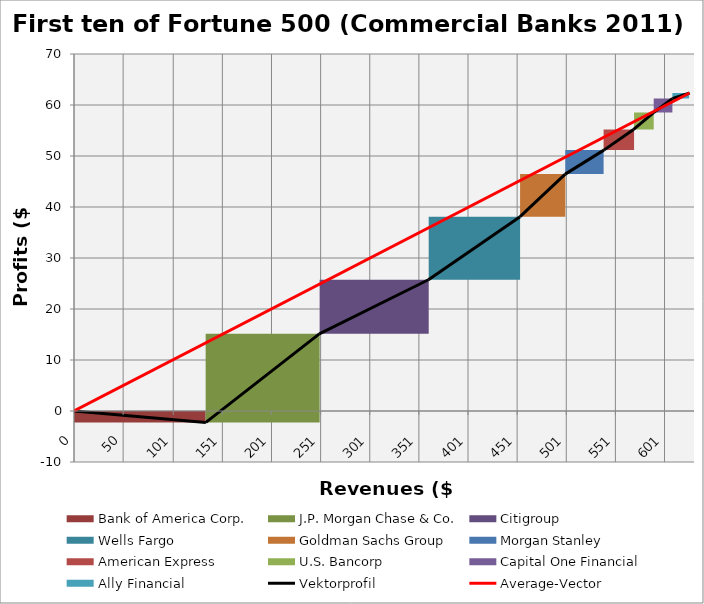
| Category | transparent | Bank of America Corp. | J.P. Morgan Chase & Co. | Citigroup | Wells Fargo | Goldman Sachs Group | Morgan Stanley | American Express | U.S. Bancorp | Capital One Financial | Ally Financial | Border right & top |
|---|---|---|---|---|---|---|---|---|---|---|---|---|
| 0.0 | 0 | -2.238 | 0 | 0 | 0 | 0 | 0 | 0 | 0 | 0 | 0 | 0 |
| 134.194 | 0 | -2.238 | 0 | 0 | 0 | 0 | 0 | 0 | 0 | 0 | 0 | 0 |
| 134.194 | -2.238 | 0 | 17.37 | 0 | 0 | 0 | 0 | 0 | 0 | 0 | 0 | 0 |
| 249.66899999999998 | -2.238 | 0 | 17.37 | 0 | 0 | 0 | 0 | 0 | 0 | 0 | 0 | 0 |
| 249.66899999999998 | 15.132 | 0 | 0 | 10.602 | 0 | 0 | 0 | 0 | 0 | 0 | 0 | 0 |
| 360.724 | 15.132 | 0 | 0 | 10.602 | 0 | 0 | 0 | 0 | 0 | 0 | 0 | 0 |
| 360.724 | 25.734 | 0 | 0 | 0 | 12.362 | 0 | 0 | 0 | 0 | 0 | 0 | 0 |
| 453.97299999999996 | 25.734 | 0 | 0 | 0 | 12.362 | 0 | 0 | 0 | 0 | 0 | 0 | 0 |
| 453.97299999999996 | 38.096 | 0 | 0 | 0 | 0 | 8.354 | 0 | 0 | 0 | 0 | 0 | 0 |
| 499.93999999999994 | 38.096 | 0 | 0 | 0 | 0 | 8.354 | 0 | 0 | 0 | 0 | 0 | 0 |
| 499.93999999999994 | 46.45 | 0 | 0 | 0 | 0 | 0 | 4.703 | 0 | 0 | 0 | 0 | 0 |
| 539.26 | 46.45 | 0 | 0 | 0 | 0 | 0 | 4.703 | 0 | 0 | 0 | 0 | 0 |
| 539.26 | 51.153 | 0 | 0 | 0 | 0 | 0 | 0 | 4.057 | 0 | 0 | 0 | 0 |
| 569.502 | 51.153 | 0 | 0 | 0 | 0 | 0 | 0 | 4.057 | 0 | 0 | 0 | 0 |
| 569.502 | 55.21 | 0 | 0 | 0 | 0 | 0 | 0 | 0 | 3.317 | 0 | 0 | 0 |
| 590.02 | 55.21 | 0 | 0 | 0 | 0 | 0 | 0 | 0 | 3.317 | 0 | 0 | 0 |
| 590.02 | 58.527 | 0 | 0 | 0 | 0 | 0 | 0 | 0 | 0 | 2.743 | 0 | 0 |
| 609.087 | 58.527 | 0 | 0 | 0 | 0 | 0 | 0 | 0 | 0 | 2.743 | 0 | 0 |
| 609.087 | 61.27 | 0 | 0 | 0 | 0 | 0 | 0 | 0 | 0 | 0 | 1.075 | 0 |
| 626.46 | 61.27 | 0 | 0 | 0 | 0 | 0 | 0 | 0 | 0 | 0 | 1.075 | 0 |
| 626.46 | 62.345 | 0 | 0 | 0 | 0 | 0 | 0 | 0 | 0 | 0 | 0 | 0 |
| 631.46 | 62.345 | 0 | 0 | 0 | 0 | 0 | 0 | 0 | 0 | 0 | 0 | 0 |
| 631.46 | 62.345 | 0 | 0 | 0 | 0 | 0 | 0 | 0 | 0 | 0 | 0 | 0 |